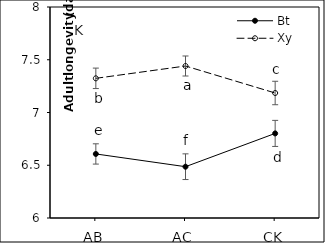
| Category | Bt | Xy |
|---|---|---|
| AB | 6.607 | 7.324 |
| AC | 6.486 | 7.441 |
| CK | 6.802 | 7.185 |